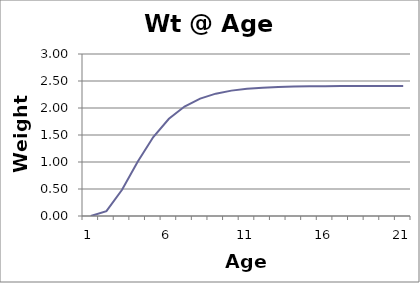
| Category | Weight |
|---|---|
| 0 | 0 |
| 1 | 0.09 |
| 2 | 0.486 |
| 3 | 1.005 |
| 4 | 1.463 |
| 5 | 1.8 |
| 6 | 2.028 |
| 7 | 2.174 |
| 8 | 2.266 |
| 9 | 2.322 |
| 10 | 2.356 |
| 11 | 2.377 |
| 12 | 2.389 |
| 13 | 2.397 |
| 14 | 2.402 |
| 15 | 2.404 |
| 16 | 2.406 |
| 17 | 2.407 |
| 18 | 2.407 |
| 19 | 2.408 |
| 20 | 2.408 |